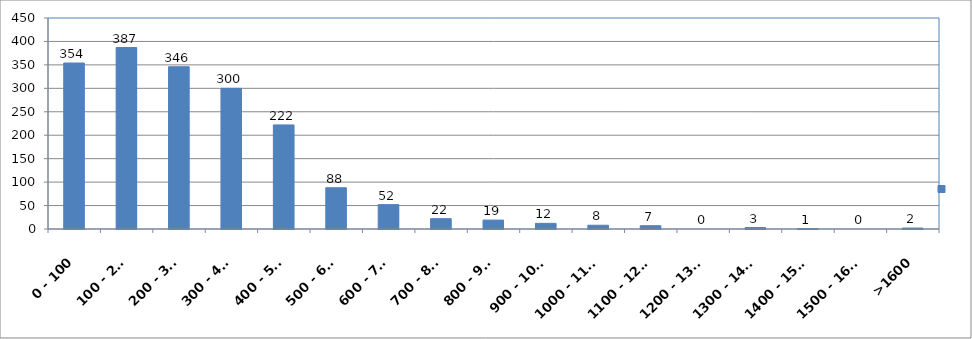
| Category | Series 0 |
|---|---|
| 0 - 100 | 354 |
| 100 - 200 | 387 |
| 200 - 300 | 346 |
| 300 - 400 | 300 |
| 400 - 500 | 222 |
| 500 - 600 | 88 |
| 600 - 700 | 52 |
| 700 - 800 | 22 |
| 800 - 900 | 19 |
| 900 - 1000 | 12 |
| 1000 - 1100 | 8 |
| 1100 - 1200 | 7 |
| 1200 - 1300 | 0 |
| 1300 - 1400 | 3 |
| 1400 - 1500 | 1 |
| 1500 - 1600 | 0 |
| >1600 | 2 |